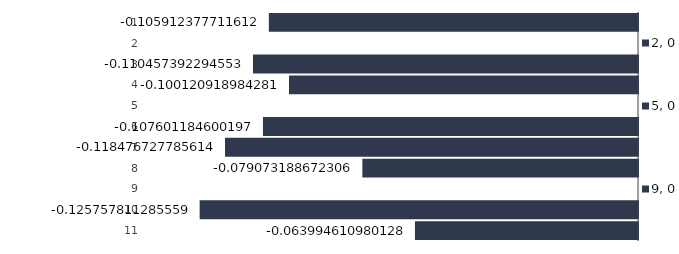
| Category | Alo VVJ |
|---|---|
| 0 | -0.106 |
| 01/01/1900 | 0 |
| 02/01/1900 | -0.11 |
| 03/01/1900 | -0.1 |
| 04/01/1900 | 0 |
| 05/01/1900 | -0.108 |
| 06/01/1900 | -0.118 |
| 07/01/1900 | -0.079 |
| 08/01/1900 | 0 |
| 09/01/1900 | -0.126 |
| 10/01/1900 | -0.064 |